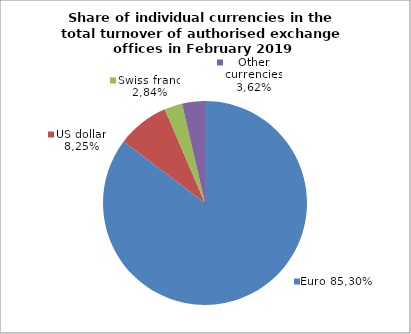
| Category | EUR |
|---|---|
| 0 | 85.297 |
| 1 | 8.245 |
| 2 | 2.837 |
| 3 | 3.621 |